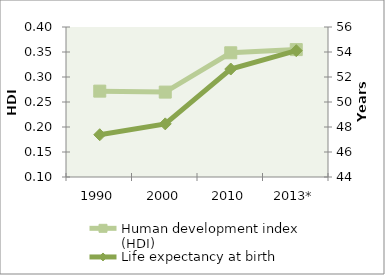
| Category | Human development index (HDI) |
|---|---|
| 1990 | 0.272 |
| 2000 | 0.27 |
| 2010 | 0.348 |
| 2013* | 0.355 |